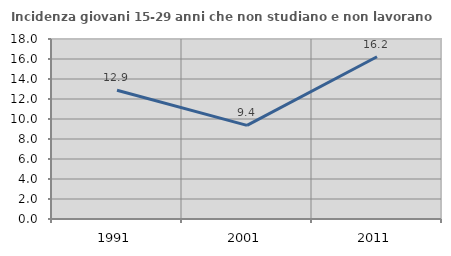
| Category | Incidenza giovani 15-29 anni che non studiano e non lavorano  |
|---|---|
| 1991.0 | 12.88 |
| 2001.0 | 9.366 |
| 2011.0 | 16.227 |